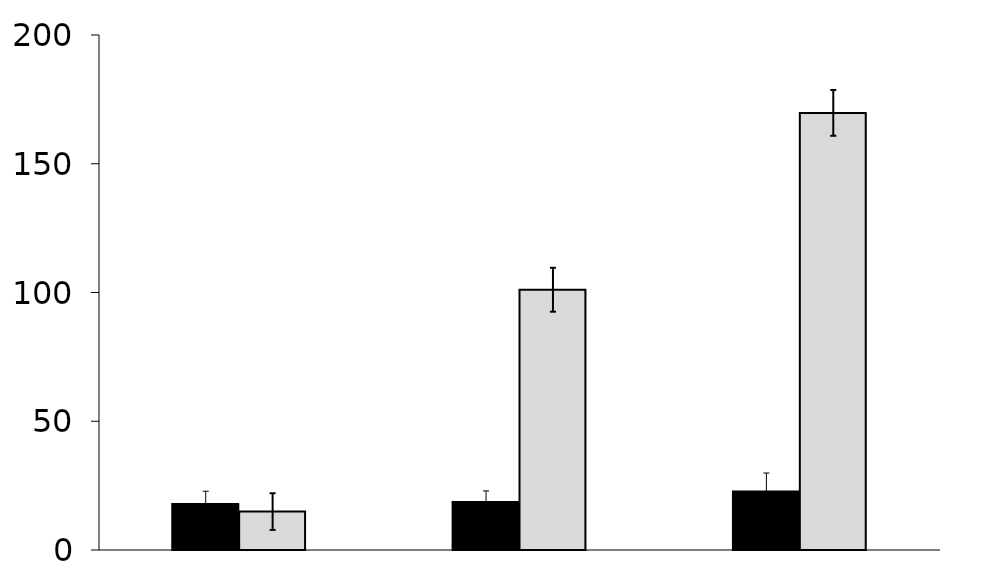
| Category | Control | EStim |
|---|---|---|
|  | 17869.333 | 14918 |
|  | 18646.667 | 101073.333 |
|  | 22744.667 | 169753 |